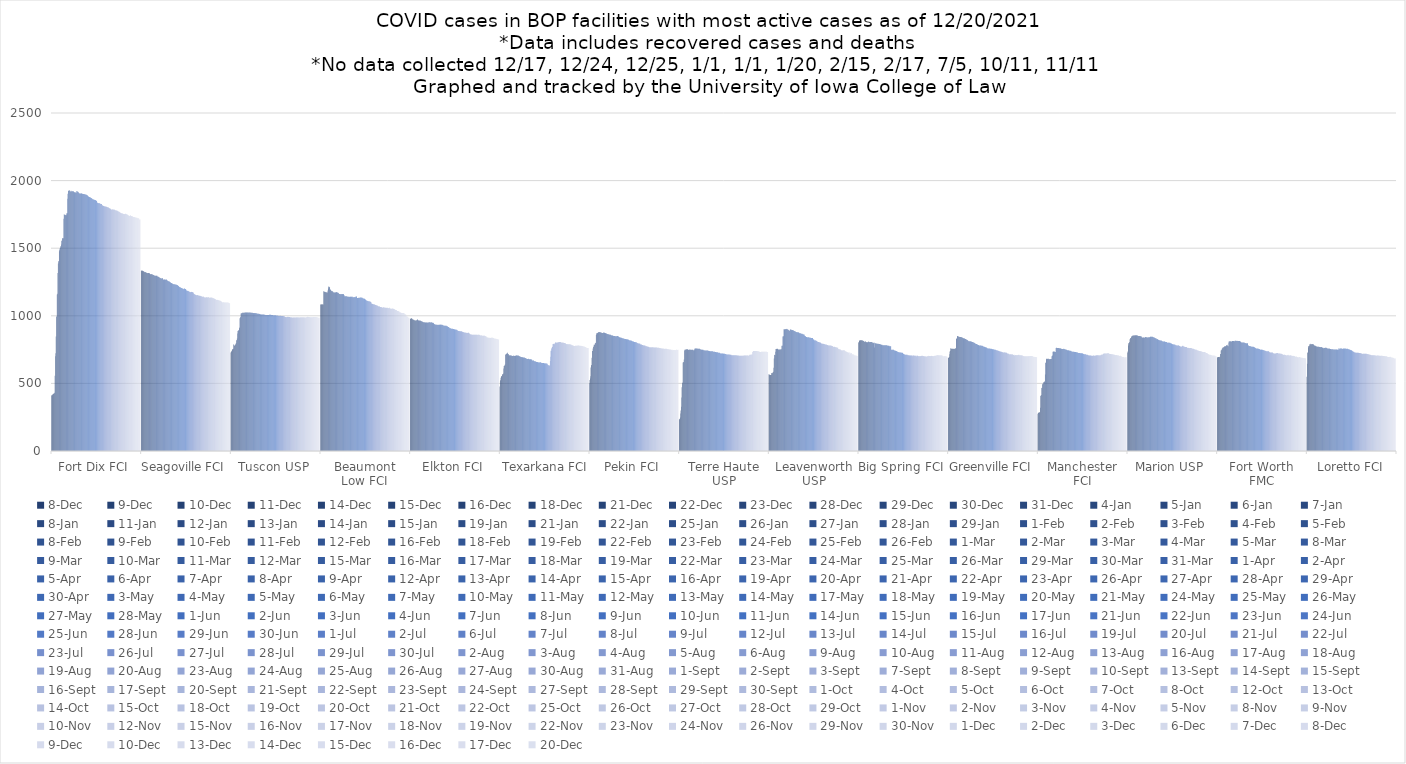
| Category | 8-Dec | 9-Dec | 10-Dec | 11-Dec | 14-Dec | 15-Dec | 16-Dec | 18-Dec | 21-Dec | 22-Dec | 23-Dec | 28-Dec | 29-Dec | 30-Dec | 31-Dec | 4-Jan | 5-Jan | 6-Jan | 7-Jan | 8-Jan | 11-Jan | 12-Jan | 13-Jan | 14-Jan | 15-Jan | 19-Jan | 21-Jan | 22-Jan | 25-Jan | 26-Jan | 27-Jan | 28-Jan | 29-Jan | 1-Feb | 2-Feb | 3-Feb | 4-Feb | 5-Feb | 8-Feb | 9-Feb | 10-Feb | 11-Feb | 12-Feb | 16-Feb | 18-Feb | 19-Feb | 22-Feb | 23-Feb | 24-Feb | 25-Feb | 26-Feb | 1-Mar | 2-Mar | 3-Mar | 4-Mar | 5-Mar | 8-Mar | 9-Mar | 10-Mar | 11-Mar | 12-Mar | 15-Mar | 16-Mar | 17-Mar | 18-Mar | 19-Mar | 22-Mar | 23-Mar | 24-Mar | 25-Mar | 26-Mar | 29-Mar | 30-Mar | 31-Mar | 1-Apr | 2-Apr | 5-Apr | 6-Apr | 7-Apr | 8-Apr | 9-Apr | 12-Apr | 13-Apr | 14-Apr | 15-Apr | 16-Apr | 19-Apr | 20-Apr | 21-Apr | 22-Apr | 23-Apr | 26-Apr | 27-Apr | 28-Apr | 29-Apr | 30-Apr | 3-May | 4-May | 5-May | 6-May | 7-May | 10-May | 11-May | 12-May | 13-May | 14-May | 17-May | 18-May | 19-May | 20-May | 21-May | 24-May | 25-May | 26-May | 27-May | 28-May | 1-Jun | 2-Jun | 3-Jun | 4-Jun | 7-Jun | 8-Jun | 9-Jun | 10-Jun | 11-Jun | 14-Jun | 15-Jun | 16-Jun | 17-Jun | 21-Jun | 22-Jun | 23-Jun | 24-Jun | 25-Jun | 28-Jun | 29-Jun | 30-Jun | 1-Jul | 2-Jul | 6-Jul | 7-Jul | 8-Jul | 9-Jul | 12-Jul | 13-Jul | 14-Jul | 15-Jul | 16-Jul | 19-Jul | 20-Jul | 21-Jul | 22-Jul | 23-Jul | 26-Jul | 27-Jul | 28-Jul | 29-Jul | 30-Jul | 2-Aug | 3-Aug | 4-Aug | 5-Aug | 6-Aug | 9-Aug | 10-Aug | 11-Aug | 12-Aug | 13-Aug | 16-Aug | 17-Aug | 18-Aug | 19-Aug | 20-Aug | 23-Aug | 24-Aug | 25-Aug | 26-Aug | 27-Aug | 30-Aug | 31-Aug | 1-Sep | 2-Sep | 3-Sep | 7-Sep | 8-Sep | 9-Sep | 10-Sep | 13-Sep | 14-Sep | 15-Sep | 16-Sep | 17-Sep | 20-Sep | 21-Sep | 22-Sep | 23-Sep | 24-Sep | 27-Sep | 28-Sep | 29-Sep | 30-Sep | 1-Oct | 4-Oct | 5-Oct | 6-Oct | 7-Oct | 8-Oct | 12-Oct | 13-Oct | 14-Oct | 15-Oct | 18-Oct | 19-Oct | 20-Oct | 21-Oct | 22-Oct | 25-Oct | 26-Oct | 27-Oct | 28-Oct | 29-Oct | 1-Nov | 2-Nov | 3-Nov | 4-Nov | 5-Nov | 8-Nov | 9-Nov | 10-Nov | 12-Nov | 15-Nov | 16-Nov | 17-Nov | 18-Nov | 19-Nov | 22-Nov | 23-Nov | 24-Nov | 26-Nov | 29-Nov | 30-Nov | 1-Dec | 2-Dec | 3-Dec | 6-Dec | 7-Dec | 13-Dec | 17-Dec | 20-Dec |
|---|---|---|---|---|---|---|---|---|---|---|---|---|---|---|---|---|---|---|---|---|---|---|---|---|---|---|---|---|---|---|---|---|---|---|---|---|---|---|---|---|---|---|---|---|---|---|---|---|---|---|---|---|---|---|---|---|---|---|---|---|---|---|---|---|---|---|---|---|---|---|---|---|---|---|---|---|---|---|---|---|---|---|---|---|---|---|---|---|---|---|---|---|---|---|---|---|---|---|---|---|---|---|---|---|---|---|---|---|---|---|---|---|---|---|---|---|---|---|---|---|---|---|---|---|---|---|---|---|---|---|---|---|---|---|---|---|---|---|---|---|---|---|---|---|---|---|---|---|---|---|---|---|---|---|---|---|---|---|---|---|---|---|---|---|---|---|---|---|---|---|---|---|---|---|---|---|---|---|---|---|---|---|---|---|---|---|---|---|---|---|---|---|---|---|---|---|---|---|---|---|---|---|---|---|---|---|---|---|---|---|---|---|---|---|---|---|---|---|---|---|---|---|---|---|---|---|---|---|---|---|---|---|---|---|---|---|---|---|---|---|---|---|---|---|---|---|---|---|---|
| Fort Dix FCI | 1723 | 1722 | 1722 | 415 | 1721 | 1717 | 1711 | 424 | 427 | 430 | 556 | 700 | 723 | 847 | 991 | 997 | 1158 | 1163 | 1316 | 1387 | 1401 | 1406 | 1478 | 1487 | 1497 | 1502 | 1515 | 1512 | 1527 | 1556 | 1556 | 1574 | 1573 | 1573 | 1574 | 1718 | 1751 | 1748 | 1748 | 1747 | 1746 | 1743 | 1743 | 1751 | 1760 | 1758 | 1865 | 1902 | 1925 | 1923 | 1927 | 1927 | 1928 | 1926 | 1921 | 1918 | 1924 | 1925 | 1920 | 1915 | 1923 | 1923 | 1922 | 1922 | 1917 | 1913 | 1913 | 1913 | 1913 | 1913 | 1909 | 1910 | 1923 | 1921 | 1921 | 1918 | 1917 | 1915 | 1910 | 1906 | 1906 | 1904 | 1904 | 1904 | 1904 | 1907 | 1905 | 1905 | 1903 | 1903 | 1901 | 1901 | 1900 | 1900 | 1900 | 1899 | 1897 | 1898 | 1897 | 1897 | 1895 | 1893 | 1892 | 1890 | 1890 | 1884 | 1883 | 1881 | 1878 | 1878 | 1876 | 1876 | 1875 | 1872 | 1871 | 1870 | 1869 | 1863 | 1862 | 1862 | 1860 | 1860 | 1859 | 1859 | 1857 | 1857 | 1855 | 1854 | 1853 | 1850 | 1850 | 1838 | 1837 | 1834 | 1834 | 1833 | 1833 | 1833 | 1833 | 1833 | 1827 | 1826 | 1827 | 1827 | 1826 | 1819 | 1816 | 1814 | 1814 | 1812 | 1812 | 1811 | 1810 | 1809 | 1809 | 1808 | 1807 | 1807 | 1807 | 1805 | 1803 | 1803 | 1802 | 1801 | 1800 | 1796 | 1795 | 1795 | 1794 | 1792 | 1789 | 1786 | 1786 | 1785 | 1788 | 1786 | 1786 | 1785 | 1786 | 1786 | 1784 | 1784 | 1782 | 1780 | 1779 | 1779 | 1779 | 1779 | 1778 | 1775 | 1773 | 1772 | 1772 | 1772 | 1769 | 1767 | 1764 | 1762 | 1762 | 1761 | 1759 | 1758 | 1757 | 1757 | 1756 | 1754 | 1753 | 1753 | 1753 | 1752 | 1753 | 1753 | 1755 | 1754 | 1753 | 1751 | 1750 | 1750 | 1747 | 1745 | 1741 | 1741 | 1741 | 1739 | 1738 | 1738 | 1743 | 1743 | 1738 | 1737 | 1738 | 1739 | 1734 | 1732 | 1731 | 1731 | 1731 | 1731 | 1729 | 1728 | 1728 | 1725 | 1725 | 1725 | 1725 | 1725 | 1721 | 1711 | 1713 |
| Seagoville FCI | 1098 | 1098 | 1098 | 1334 | 1096 | 1096 | 1094 | 1329 | 1327 | 1326 | 1322 | 1324 | 1324 | 1322 | 1321 | 1320 | 1317 | 1316 | 1315 | 1316 | 1316 | 1317 | 1316 | 1315 | 1313 | 1314 | 1308 | 1307 | 1309 | 1309 | 1308 | 1308 | 1306 | 1305 | 1303 | 1302 | 1301 | 1300 | 1298 | 1297 | 1297 | 1296 | 1297 | 1296 | 1297 | 1297 | 1297 | 1290 | 1289 | 1288 | 1288 | 1287 | 1285 | 1282 | 1281 | 1279 | 1277 | 1277 | 1275 | 1276 | 1278 | 1278 | 1278 | 1269 | 1268 | 1267 | 1268 | 1268 | 1268 | 1267 | 1267 | 1268 | 1268 | 1268 | 1264 | 1262 | 1259 | 1258 | 1258 | 1254 | 1254 | 1252 | 1253 | 1249 | 1248 | 1244 | 1243 | 1242 | 1241 | 1238 | 1238 | 1236 | 1235 | 1234 | 1234 | 1234 | 1233 | 1232 | 1232 | 1232 | 1230 | 1230 | 1229 | 1227 | 1227 | 1224 | 1223 | 1221 | 1218 | 1215 | 1213 | 1211 | 1211 | 1210 | 1208 | 1206 | 1206 | 1204 | 1201 | 1201 | 1201 | 1199 | 1197 | 1199 | 1203 | 1202 | 1198 | 1199 | 1196 | 1192 | 1187 | 1186 | 1185 | 1184 | 1185 | 1184 | 1182 | 1180 | 1178 | 1177 | 1175 | 1175 | 1176 | 1177 | 1176 | 1176 | 1176 | 1175 | 1175 | 1174 | 1166 | 1165 | 1162 | 1159 | 1158 | 1156 | 1155 | 1153 | 1152 | 1152 | 1153 | 1153 | 1152 | 1150 | 1151 | 1150 | 1149 | 1149 | 1149 | 1149 | 1147 | 1144 | 1144 | 1145 | 1142 | 1141 | 1141 | 1141 | 1142 | 1140 | 1138 | 1136 | 1137 | 1136 | 1136 | 1136 | 1137 | 1138 | 1137 | 1137 | 1135 | 1136 | 1138 | 1137 | 1137 | 1134 | 1133 | 1133 | 1134 | 1136 | 1136 | 1135 | 1134 | 1134 | 1134 | 1130 | 1130 | 1129 | 1129 | 1126 | 1126 | 1126 | 1124 | 1122 | 1121 | 1119 | 1117 | 1117 | 1118 | 1116 | 1116 | 1115 | 1115 | 1115 | 1113 | 1112 | 1111 | 1111 | 1110 | 1106 | 1105 | 1104 | 1101 | 1099 | 1100 | 1100 | 1100 | 1100 | 1098 | 1098 | 1098 | 1099 | 1098 | 1098 | 1099 | 1098 | 1097 | 1093 | 1092 |
| Tuscon USP | 990 | 989 | 989 | 741 | 986 | 986 | 985 | 756 | 787 | 787 | 779 | 779 | 784 | 787 | 789 | 798 | 819 | 819 | 833 | 869 | 887 | 889 | 891 | 895 | 908 | 913 | 981 | 990 | 990 | 1017 | 1019 | 1018 | 1019 | 1023 | 1023 | 1023 | 1022 | 1022 | 1022 | 1023 | 1024 | 1024 | 1024 | 1025 | 1025 | 1025 | 1025 | 1025 | 1025 | 1025 | 1024 | 1024 | 1023 | 1024 | 1024 | 1024 | 1024 | 1023 | 1023 | 1022 | 1023 | 1022 | 1022 | 1020 | 1021 | 1020 | 1019 | 1019 | 1020 | 1020 | 1020 | 1019 | 1019 | 1019 | 1018 | 1016 | 1016 | 1017 | 1016 | 1016 | 1016 | 1015 | 1014 | 1013 | 1011 | 1011 | 1009 | 1010 | 1010 | 1010 | 1010 | 1009 | 1009 | 1009 | 1009 | 1009 | 1007 | 1007 | 1007 | 1005 | 1005 | 1005 | 1006 | 1006 | 1006 | 1006 | 1006 | 1006 | 1006 | 1006 | 1007 | 1007 | 1007 | 1007 | 1007 | 1007 | 1006 | 1006 | 1006 | 1006 | 1005 | 1004 | 1004 | 1003 | 1004 | 1004 | 1003 | 1003 | 1004 | 1004 | 1003 | 1003 | 1001 | 1001 | 1002 | 1002 | 1000 | 999 | 999 | 999 | 1000 | 1000 | 1000 | 999 | 999 | 999 | 999 | 998 | 998 | 998 | 998 | 996 | 996 | 996 | 994 | 992 | 992 | 992 | 989 | 991 | 990 | 992 | 992 | 993 | 993 | 991 | 991 | 992 | 991 | 991 | 990 | 989 | 988 | 988 | 989 | 987 | 986 | 987 | 987 | 988 | 988 | 987 | 987 | 987 | 987 | 987 | 987 | 988 | 988 | 989 | 989 | 988 | 988 | 988 | 988 | 989 | 987 | 987 | 987 | 988 | 989 | 990 | 989 | 988 | 989 | 989 | 988 | 988 | 989 | 989 | 989 | 988 | 988 | 988 | 988 | 988 | 990 | 990 | 991 | 991 | 993 | 993 | 992 | 992 | 992 | 992 | 990 | 989 | 990 | 989 | 990 | 990 | 990 | 989 | 989 | 991 | 992 | 992 | 991 | 991 | 991 | 992 | 991 | 991 | 991 | 991 | 987 | 985 | 985 |
| Beaumont Low FCI | 998 | 995 | 994 | 1084 | 991 | 988 | 988 | 1081 | 1083 | 1184 | 1178 | 1178 | 1178 | 1178 | 1176 | 1175 | 1174 | 1175 | 1173 | 1173 | 1172 | 1187 | 1201 | 1215 | 1217 | 1214 | 1211 | 1211 | 1194 | 1194 | 1190 | 1186 | 1183 | 1182 | 1182 | 1182 | 1177 | 1174 | 1173 | 1173 | 1173 | 1173 | 1173 | 1172 | 1174 | 1174 | 1176 | 1175 | 1174 | 1173 | 1169 | 1170 | 1168 | 1163 | 1162 | 1162 | 1162 | 1161 | 1160 | 1157 | 1161 | 1161 | 1161 | 1162 | 1160 | 1160 | 1160 | 1161 | 1153 | 1145 | 1144 | 1142 | 1146 | 1145 | 1145 | 1144 | 1143 | 1142 | 1141 | 1141 | 1140 | 1140 | 1140 | 1141 | 1139 | 1140 | 1140 | 1141 | 1140 | 1140 | 1141 | 1140 | 1140 | 1136 | 1136 | 1139 | 1139 | 1139 | 1137 | 1135 | 1140 | 1140 | 1143 | 1142 | 1142 | 1132 | 1132 | 1132 | 1132 | 1133 | 1133 | 1133 | 1133 | 1133 | 1135 | 1136 | 1136 | 1136 | 1134 | 1133 | 1133 | 1130 | 1129 | 1127 | 1128 | 1128 | 1127 | 1125 | 1123 | 1120 | 1117 | 1115 | 1114 | 1112 | 1112 | 1110 | 1110 | 1108 | 1108 | 1107 | 1107 | 1105 | 1104 | 1104 | 1103 | 1100 | 1091 | 1090 | 1090 | 1087 | 1087 | 1086 | 1086 | 1085 | 1084 | 1083 | 1083 | 1079 | 1079 | 1079 | 1078 | 1077 | 1077 | 1076 | 1073 | 1070 | 1070 | 1069 | 1069 | 1069 | 1068 | 1066 | 1065 | 1065 | 1065 | 1065 | 1060 | 1059 | 1062 | 1062 | 1063 | 1064 | 1062 | 1062 | 1060 | 1060 | 1059 | 1059 | 1057 | 1059 | 1059 | 1059 | 1059 | 1057 | 1057 | 1056 | 1056 | 1059 | 1059 | 1054 | 1054 | 1053 | 1053 | 1053 | 1053 | 1053 | 1054 | 1054 | 1054 | 1051 | 1051 | 1050 | 1049 | 1046 | 1045 | 1042 | 1043 | 1042 | 1042 | 1037 | 1036 | 1035 | 1035 | 1035 | 1031 | 1032 | 1030 | 1025 | 1025 | 1025 | 1024 | 1023 | 1021 | 1021 | 1020 | 1020 | 1020 | 1020 | 1020 | 1019 | 1016 | 1017 | 1009 | 1010 | 1011 | 1008 | 994 | 985 | 985 |
| Elkton FCI | 830 | 829 | 829 | 980 | 828 | 825 | 825 | 975 | 973 | 971 | 970 | 970 | 969 | 966 | 966 | 966 | 966 | 966 | 966 | 969 | 971 | 973 | 973 | 967 | 965 | 966 | 964 | 965 | 965 | 965 | 963 | 961 | 959 | 959 | 959 | 957 | 955 | 955 | 953 | 953 | 953 | 952 | 951 | 951 | 951 | 951 | 951 | 951 | 951 | 950 | 948 | 950 | 951 | 951 | 953 | 953 | 953 | 953 | 951 | 951 | 952 | 952 | 950 | 948 | 948 | 948 | 948 | 947 | 943 | 939 | 938 | 937 | 936 | 934 | 936 | 934 | 933 | 933 | 932 | 933 | 933 | 932 | 934 | 934 | 934 | 934 | 934 | 935 | 934 | 933 | 933 | 933 | 933 | 932 | 930 | 929 | 928 | 928 | 927 | 926 | 927 | 927 | 926 | 926 | 926 | 923 | 922 | 921 | 920 | 918 | 918 | 918 | 913 | 910 | 907 | 907 | 907 | 906 | 905 | 905 | 904 | 904 | 904 | 903 | 903 | 903 | 901 | 900 | 898 | 898 | 898 | 896 | 896 | 896 | 896 | 894 | 892 | 889 | 887 | 887 | 887 | 887 | 886 | 886 | 886 | 886 | 885 | 885 | 884 | 883 | 881 | 880 | 880 | 879 | 879 | 877 | 877 | 875 | 876 | 875 | 875 | 874 | 873 | 873 | 873 | 874 | 874 | 874 | 874 | 872 | 867 | 865 | 863 | 863 | 861 | 861 | 861 | 860 | 860 | 859 | 859 | 860 | 860 | 860 | 860 | 860 | 860 | 860 | 860 | 859 | 859 | 859 | 858 | 860 | 860 | 860 | 860 | 860 | 860 | 858 | 857 | 855 | 855 | 856 | 855 | 855 | 853 | 853 | 853 | 853 | 853 | 852 | 854 | 853 | 850 | 850 | 848 | 848 | 846 | 841 | 841 | 840 | 840 | 838 | 838 | 837 | 837 | 837 | 836 | 836 | 836 | 838 | 838 | 838 | 837 | 837 | 838 | 838 | 836 | 836 | 834 | 832 | 830 | 831 | 831 | 831 | 829 | 824 | 825 |
| Texarkana FCI | 767 | 764 | 764 | 541 | 762 | 762 | 761 | 566 | 567 | 567 | 574 | 610 | 629 | 630 | 633 | 639 | 711 | 713 | 717 | 720 | 721 | 722 | 723 | 728 | 718 | 717 | 708 | 707 | 709 | 708 | 708 | 706 | 706 | 705 | 707 | 705 | 703 | 703 | 703 | 707 | 705 | 702 | 703 | 704 | 704 | 704 | 704 | 707 | 708 | 707 | 706 | 705 | 708 | 707 | 704 | 702 | 701 | 701 | 701 | 697 | 696 | 694 | 695 | 695 | 694 | 693 | 693 | 691 | 691 | 691 | 691 | 691 | 688 | 687 | 688 | 685 | 684 | 682 | 681 | 681 | 681 | 682 | 682 | 680 | 678 | 679 | 678 | 678 | 678 | 678 | 677 | 677 | 676 | 670 | 670 | 670 | 670 | 671 | 666 | 664 | 663 | 663 | 663 | 661 | 661 | 658 | 658 | 658 | 658 | 657 | 657 | 655 | 655 | 654 | 655 | 656 | 656 | 656 | 653 | 652 | 651 | 651 | 650 | 650 | 650 | 650 | 650 | 649 | 649 | 648 | 649 | 648 | 648 | 647 | 647 | 647 | 646 | 639 | 636 | 635 | 634 | 633 | 633 | 633 | 665 | 698 | 742 | 742 | 756 | 763 | 771 | 770 | 792 | 792 | 794 | 790 | 790 | 794 | 798 | 804 | 803 | 800 | 802 | 801 | 803 | 803 | 803 | 803 | 805 | 807 | 807 | 806 | 807 | 807 | 807 | 805 | 802 | 801 | 802 | 802 | 801 | 800 | 800 | 800 | 798 | 799 | 799 | 798 | 796 | 794 | 791 | 790 | 791 | 791 | 790 | 790 | 790 | 790 | 790 | 790 | 789 | 789 | 788 | 787 | 786 | 785 | 783 | 783 | 783 | 781 | 780 | 779 | 776 | 776 | 777 | 777 | 778 | 778 | 778 | 778 | 778 | 778 | 779 | 780 | 780 | 780 | 780 | 779 | 779 | 778 | 778 | 778 | 777 | 778 | 777 | 776 | 776 | 776 | 773 | 773 | 773 | 774 | 772 | 771 | 770 | 769 | 763 | 761 | 762 |
| Pekin FCI | 747 | 746 | 748 | 552 | 748 | 748 | 747 | 690 | 739 | 739 | 758 | 771 | 771 | 786 | 786 | 785 | 796 | 800 | 798 | 858 | 868 | 873 | 871 | 872 | 874 | 876 | 879 | 880 | 881 | 879 | 880 | 877 | 878 | 879 | 875 | 874 | 873 | 873 | 873 | 872 | 876 | 876 | 876 | 874 | 873 | 872 | 871 | 871 | 870 | 870 | 867 | 865 | 865 | 864 | 864 | 863 | 861 | 862 | 860 | 859 | 859 | 859 | 857 | 856 | 855 | 855 | 855 | 855 | 852 | 850 | 850 | 851 | 851 | 850 | 849 | 849 | 849 | 849 | 849 | 850 | 850 | 850 | 850 | 846 | 843 | 841 | 841 | 841 | 841 | 838 | 838 | 837 | 838 | 835 | 834 | 834 | 834 | 834 | 831 | 831 | 831 | 829 | 829 | 829 | 829 | 826 | 826 | 826 | 826 | 824 | 824 | 824 | 823 | 821 | 818 | 819 | 819 | 818 | 818 | 817 | 815 | 815 | 813 | 812 | 810 | 810 | 809 | 808 | 807 | 806 | 806 | 806 | 805 | 805 | 804 | 803 | 801 | 798 | 797 | 797 | 796 | 796 | 796 | 795 | 793 | 793 | 788 | 788 | 788 | 787 | 786 | 784 | 784 | 784 | 783 | 781 | 780 | 780 | 780 | 780 | 779 | 774 | 775 | 775 | 775 | 774 | 772 | 771 | 771 | 771 | 770 | 768 | 768 | 768 | 768 | 766 | 767 | 767 | 766 | 767 | 767 | 767 | 766 | 767 | 765 | 765 | 765 | 765 | 766 | 766 | 766 | 766 | 765 | 766 | 764 | 764 | 764 | 764 | 764 | 763 | 761 | 761 | 760 | 761 | 760 | 759 | 760 | 759 | 759 | 757 | 758 | 758 | 758 | 755 | 755 | 756 | 757 | 756 | 756 | 755 | 756 | 756 | 755 | 754 | 753 | 752 | 752 | 752 | 751 | 751 | 751 | 752 | 750 | 747 | 747 | 749 | 749 | 749 | 746 | 746 | 747 | 747 | 747 | 747 | 747 | 747 | 748 | 747 | 748 |
| Terre Haute USP | 734 | 734 | 735 | 247 | 735 | 735 | 733 | 396 | 472 | 501 | 507 | 655 | 656 | 658 | 676 | 742 | 748 | 748 | 747 | 752 | 753 | 753 | 751 | 752 | 752 | 750 | 747 | 749 | 749 | 749 | 750 | 749 | 749 | 750 | 747 | 748 | 748 | 748 | 748 | 748 | 748 | 744 | 745 | 746 | 752 | 758 | 758 | 758 | 758 | 759 | 758 | 758 | 758 | 757 | 757 | 757 | 757 | 757 | 757 | 756 | 755 | 751 | 751 | 750 | 749 | 749 | 748 | 748 | 748 | 748 | 746 | 746 | 746 | 744 | 744 | 744 | 744 | 744 | 744 | 744 | 744 | 743 | 743 | 742 | 741 | 740 | 740 | 739 | 738 | 738 | 738 | 738 | 738 | 737 | 737 | 737 | 737 | 736 | 735 | 735 | 735 | 735 | 734 | 733 | 733 | 732 | 731 | 731 | 730 | 731 | 730 | 729 | 727 | 727 | 726 | 726 | 726 | 724 | 722 | 722 | 722 | 722 | 722 | 722 | 722 | 722 | 722 | 720 | 720 | 720 | 720 | 719 | 717 | 717 | 717 | 715 | 714 | 714 | 713 | 713 | 713 | 713 | 713 | 713 | 713 | 711 | 712 | 711 | 711 | 711 | 709 | 709 | 709 | 709 | 709 | 709 | 709 | 709 | 709 | 709 | 708 | 708 | 708 | 708 | 708 | 707 | 707 | 707 | 707 | 707 | 706 | 705 | 705 | 704 | 704 | 704 | 704 | 704 | 704 | 704 | 705 | 705 | 705 | 705 | 705 | 706 | 706 | 706 | 706 | 706 | 706 | 706 | 706 | 706 | 706 | 707 | 708 | 705 | 705 | 704 | 709 | 709 | 711 | 711 | 711 | 711 | 711 | 713 | 713 | 713 | 732 | 735 | 739 | 739 | 739 | 740 | 739 | 740 | 740 | 740 | 739 | 739 | 739 | 738 | 738 | 739 | 739 | 737 | 735 | 735 | 734 | 734 | 733 | 733 | 733 | 734 | 735 | 735 | 734 | 734 | 734 | 735 | 735 | 735 | 735 | 735 | 734 | 733 | 733 |
| Leavenworth USP | 707 | 707 | 706 | 564 | 704 | 705 | 704 | 564 | 576 | 577 | 575 | 577 | 584 | 586 | 615 | 685 | 712 | 710 | 709 | 735 | 754 | 754 | 755 | 756 | 756 | 756 | 755 | 751 | 750 | 750 | 751 | 748 | 752 | 751 | 750 | 752 | 752 | 778 | 777 | 781 | 847 | 850 | 846 | 900 | 899 | 901 | 901 | 901 | 900 | 902 | 903 | 901 | 905 | 901 | 900 | 897 | 897 | 895 | 890 | 889 | 891 | 898 | 898 | 898 | 896 | 896 | 894 | 895 | 895 | 893 | 894 | 891 | 890 | 888 | 887 | 884 | 885 | 882 | 880 | 880 | 879 | 879 | 879 | 879 | 876 | 878 | 877 | 873 | 874 | 870 | 872 | 870 | 869 | 869 | 866 | 868 | 868 | 864 | 865 | 862 | 862 | 862 | 859 | 851 | 851 | 849 | 847 | 844 | 844 | 843 | 842 | 842 | 839 | 841 | 841 | 841 | 840 | 838 | 837 | 837 | 838 | 835 | 835 | 835 | 835 | 835 | 835 | 827 | 826 | 822 | 822 | 820 | 816 | 819 | 818 | 818 | 816 | 814 | 814 | 809 | 807 | 806 | 807 | 807 | 806 | 805 | 801 | 802 | 801 | 801 | 796 | 796 | 796 | 795 | 792 | 793 | 793 | 792 | 792 | 791 | 790 | 788 | 787 | 788 | 788 | 785 | 786 | 782 | 784 | 784 | 782 | 781 | 781 | 781 | 780 | 781 | 781 | 781 | 778 | 778 | 778 | 776 | 775 | 776 | 772 | 770 | 771 | 771 | 771 | 769 | 769 | 767 | 768 | 767 | 766 | 765 | 763 | 764 | 764 | 753 | 754 | 754 | 753 | 750 | 752 | 748 | 748 | 746 | 746 | 744 | 744 | 743 | 746 | 746 | 746 | 745 | 745 | 744 | 741 | 738 | 737 | 736 | 735 | 735 | 732 | 730 | 730 | 727 | 729 | 729 | 729 | 712 | 728 | 726 | 718 | 724 | 724 | 724 | 716 | 715 | 715 | 714 | 714 | 713 | 712 | 709 | 706 | 702 | 703 |
| Big Spring FCI | 701 | 702 | 702 | 815 | 700 | 702 | 698 | 819 | 819 | 820 | 820 | 818 | 818 | 818 | 814 | 814 | 811 | 808 | 807 | 810 | 810 | 809 | 807 | 805 | 804 | 804 | 804 | 805 | 807 | 809 | 809 | 807 | 804 | 807 | 806 | 806 | 807 | 807 | 807 | 804 | 803 | 800 | 800 | 797 | 801 | 765 | 801 | 800 | 798 | 795 | 795 | 795 | 795 | 794 | 793 | 793 | 793 | 793 | 792 | 792 | 791 | 791 | 790 | 789 | 788 | 786 | 786 | 785 | 785 | 783 | 783 | 783 | 783 | 783 | 782 | 783 | 783 | 782 | 782 | 782 | 782 | 782 | 781 | 780 | 779 | 779 | 778 | 778 | 778 | 775 | 775 | 774 | 774 | 774 | 749 | 749 | 749 | 749 | 749 | 749 | 749 | 748 | 746 | 743 | 743 | 742 | 741 | 741 | 739 | 737 | 739 | 738 | 733 | 732 | 732 | 730 | 730 | 730 | 729 | 729 | 729 | 728 | 728 | 727 | 727 | 727 | 727 | 725 | 719 | 719 | 717 | 716 | 714 | 714 | 712 | 712 | 712 | 711 | 711 | 711 | 711 | 709 | 709 | 709 | 709 | 708 | 707 | 707 | 707 | 707 | 707 | 706 | 706 | 706 | 706 | 700 | 707 | 707 | 707 | 707 | 704 | 704 | 704 | 705 | 705 | 698 | 704 | 704 | 704 | 704 | 704 | 702 | 701 | 701 | 701 | 702 | 701 | 701 | 703 | 703 | 703 | 704 | 704 | 704 | 703 | 703 | 702 | 701 | 701 | 700 | 699 | 700 | 699 | 699 | 698 | 699 | 699 | 700 | 700 | 702 | 704 | 701 | 703 | 703 | 703 | 701 | 702 | 702 | 702 | 704 | 703 | 703 | 702 | 701 | 701 | 702 | 702 | 702 | 704 | 705 | 705 | 705 | 704 | 707 | 708 | 709 | 709 | 710 | 710 | 709 | 707 | 708 | 708 | 707 | 707 | 708 | 708 | 708 | 707 | 707 | 705 | 705 | 701 | 700 | 701 | 701 | 701 | 698 | 698 |
| Greenville FCI | 696 | 696 | 697 | 695 | 696 | 696 | 696 | 760 | 759 | 758 | 756 | 754 | 756 | 756 | 756 | 755 | 757 | 757 | 756 | 755 | 756 | 759 | 761 | 828 | 829 | 836 | 850 | 850 | 849 | 848 | 846 | 844 | 844 | 845 | 844 | 844 | 844 | 843 | 841 | 841 | 841 | 838 | 836 | 836 | 834 | 833 | 833 | 832 | 833 | 829 | 829 | 829 | 825 | 822 | 822 | 821 | 820 | 818 | 814 | 812 | 812 | 812 | 811 | 811 | 811 | 810 | 810 | 809 | 807 | 807 | 807 | 806 | 805 | 803 | 801 | 800 | 798 | 797 | 794 | 794 | 792 | 791 | 791 | 788 | 787 | 785 | 784 | 784 | 783 | 781 | 781 | 781 | 780 | 780 | 780 | 779 | 778 | 778 | 778 | 776 | 775 | 773 | 772 | 771 | 771 | 770 | 769 | 768 | 765 | 765 | 765 | 763 | 761 | 759 | 759 | 759 | 759 | 759 | 759 | 759 | 756 | 756 | 757 | 756 | 756 | 755 | 754 | 753 | 752 | 753 | 753 | 751 | 750 | 749 | 749 | 748 | 748 | 747 | 745 | 745 | 744 | 743 | 744 | 743 | 739 | 739 | 737 | 737 | 737 | 736 | 736 | 734 | 734 | 734 | 733 | 732 | 731 | 728 | 728 | 729 | 729 | 729 | 730 | 729 | 729 | 726 | 727 | 727 | 727 | 723 | 721 | 719 | 719 | 719 | 719 | 715 | 714 | 715 | 715 | 715 | 714 | 714 | 716 | 715 | 714 | 714 | 712 | 710 | 710 | 711 | 707 | 707 | 709 | 710 | 710 | 710 | 709 | 709 | 709 | 710 | 710 | 710 | 711 | 711 | 709 | 708 | 708 | 708 | 708 | 708 | 708 | 707 | 706 | 706 | 705 | 703 | 703 | 701 | 701 | 701 | 701 | 700 | 700 | 700 | 700 | 700 | 700 | 701 | 701 | 701 | 701 | 702 | 701 | 702 | 702 | 702 | 703 | 703 | 702 | 702 | 702 | 702 | 700 | 698 | 699 | 696 | 696 | 694 | 695 |
| Manchester FCI | 695 | 694 | 692 | 283 | 694 | 693 | 693 | 320 | 406 | 410 | 414 | 466 | 467 | 492 | 498 | 498 | 502 | 510 | 511 | 513 | 516 | 566 | 651 | 655 | 679 | 682 | 682 | 682 | 681 | 682 | 684 | 681 | 679 | 681 | 679 | 679 | 681 | 680 | 680 | 680 | 701 | 704 | 706 | 735 | 734 | 736 | 736 | 736 | 735 | 734 | 733 | 733 | 762 | 763 | 763 | 761 | 761 | 762 | 761 | 761 | 762 | 760 | 759 | 761 | 760 | 759 | 758 | 757 | 756 | 755 | 755 | 754 | 754 | 755 | 756 | 756 | 754 | 752 | 752 | 750 | 750 | 749 | 749 | 748 | 746 | 746 | 746 | 746 | 745 | 744 | 743 | 741 | 741 | 741 | 740 | 741 | 738 | 736 | 736 | 734 | 734 | 734 | 734 | 734 | 734 | 733 | 733 | 733 | 733 | 732 | 731 | 730 | 730 | 730 | 727 | 726 | 725 | 725 | 725 | 725 | 724 | 724 | 723 | 723 | 723 | 723 | 723 | 723 | 721 | 721 | 720 | 718 | 718 | 716 | 716 | 716 | 715 | 715 | 713 | 712 | 711 | 710 | 711 | 711 | 710 | 707 | 706 | 706 | 706 | 706 | 706 | 706 | 707 | 705 | 705 | 705 | 704 | 703 | 704 | 706 | 707 | 705 | 705 | 705 | 705 | 706 | 707 | 707 | 708 | 708 | 708 | 708 | 709 | 707 | 708 | 708 | 708 | 707 | 707 | 709 | 709 | 712 | 712 | 712 | 712 | 712 | 715 | 717 | 720 | 721 | 721 | 721 | 721 | 721 | 721 | 721 | 722 | 722 | 722 | 723 | 723 | 723 | 723 | 723 | 721 | 717 | 718 | 718 | 718 | 717 | 716 | 716 | 717 | 716 | 715 | 714 | 714 | 713 | 712 | 711 | 711 | 710 | 710 | 709 | 710 | 710 | 709 | 708 | 708 | 707 | 707 | 706 | 706 | 702 | 702 | 704 | 704 | 704 | 700 | 700 | 699 | 698 | 696 | 696 | 696 | 695 | 692 | 693 | 694 |
| Marion USP | 706 | 705 | 706 | 795 | 704 | 704 | 700 | 827 | 833 | 835 | 836 | 847 | 845 | 850 | 851 | 854 | 855 | 854 | 854 | 854 | 854 | 856 | 856 | 855 | 857 | 858 | 855 | 855 | 855 | 855 | 853 | 850 | 850 | 850 | 850 | 851 | 851 | 848 | 848 | 848 | 846 | 841 | 840 | 839 | 838 | 839 | 839 | 839 | 836 | 838 | 843 | 843 | 843 | 842 | 841 | 841 | 841 | 840 | 839 | 840 | 841 | 841 | 840 | 841 | 843 | 845 | 845 | 845 | 845 | 845 | 845 | 845 | 845 | 844 | 843 | 840 | 840 | 840 | 837 | 835 | 834 | 834 | 834 | 830 | 827 | 828 | 827 | 827 | 823 | 822 | 821 | 820 | 820 | 820 | 818 | 818 | 818 | 818 | 815 | 813 | 812 | 810 | 810 | 810 | 810 | 809 | 809 | 809 | 808 | 807 | 806 | 806 | 806 | 806 | 801 | 801 | 801 | 800 | 802 | 801 | 800 | 800 | 800 | 798 | 796 | 796 | 796 | 794 | 792 | 790 | 790 | 789 | 788 | 788 | 787 | 787 | 786 | 785 | 783 | 782 | 782 | 781 | 781 | 780 | 781 | 781 | 782 | 781 | 779 | 777 | 776 | 775 | 771 | 773 | 773 | 769 | 775 | 776 | 778 | 778 | 775 | 773 | 771 | 771 | 772 | 770 | 770 | 770 | 770 | 770 | 767 | 763 | 763 | 762 | 763 | 761 | 761 | 761 | 760 | 761 | 761 | 761 | 761 | 761 | 759 | 758 | 756 | 756 | 756 | 756 | 754 | 752 | 752 | 752 | 750 | 749 | 748 | 748 | 748 | 745 | 745 | 744 | 743 | 742 | 741 | 740 | 740 | 739 | 739 | 738 | 737 | 736 | 737 | 735 | 734 | 732 | 733 | 733 | 732 | 731 | 732 | 732 | 732 | 730 | 724 | 724 | 724 | 724 | 724 | 720 | 719 | 718 | 715 | 713 | 711 | 711 | 711 | 711 | 710 | 710 | 710 | 708 | 706 | 706 | 706 | 706 | 705 | 700 | 700 |
| Fort Worth FMC | 688 | 687 | 687 | 695 | 687 | 686 | 686 | 698 | 695 | 717 | 717 | 743 | 746 | 749 | 756 | 760 | 765 | 762 | 767 | 769 | 769 | 775 | 775 | 773 | 774 | 777 | 781 | 782 | 782 | 785 | 780 | 777 | 775 | 802 | 811 | 811 | 810 | 810 | 811 | 811 | 810 | 810 | 810 | 814 | 814 | 814 | 813 | 814 | 813 | 811 | 812 | 816 | 816 | 816 | 816 | 816 | 814 | 814 | 815 | 814 | 814 | 814 | 814 | 814 | 813 | 813 | 810 | 810 | 808 | 805 | 803 | 802 | 803 | 802 | 802 | 803 | 803 | 802 | 800 | 800 | 798 | 798 | 797 | 796 | 797 | 797 | 798 | 799 | 792 | 784 | 778 | 776 | 776 | 776 | 775 | 775 | 775 | 775 | 772 | 772 | 772 | 772 | 772 | 771 | 771 | 769 | 768 | 768 | 765 | 764 | 762 | 760 | 759 | 758 | 757 | 758 | 758 | 757 | 756 | 756 | 755 | 754 | 753 | 751 | 749 | 749 | 748 | 749 | 750 | 749 | 748 | 747 | 747 | 746 | 745 | 744 | 743 | 742 | 741 | 740 | 739 | 738 | 738 | 738 | 738 | 738 | 737 | 737 | 737 | 734 | 732 | 729 | 729 | 728 | 729 | 728 | 729 | 729 | 728 | 728 | 725 | 723 | 722 | 720 | 721 | 721 | 721 | 721 | 721 | 722 | 725 | 725 | 724 | 724 | 724 | 722 | 721 | 722 | 722 | 721 | 721 | 719 | 719 | 719 | 719 | 717 | 716 | 715 | 714 | 712 | 710 | 711 | 711 | 711 | 711 | 710 | 710 | 709 | 709 | 705 | 710 | 707 | 710 | 711 | 709 | 706 | 707 | 707 | 707 | 706 | 708 | 708 | 707 | 704 | 704 | 703 | 704 | 703 | 704 | 703 | 703 | 703 | 701 | 699 | 698 | 698 | 698 | 699 | 697 | 695 | 694 | 693 | 693 | 693 | 691 | 695 | 695 | 695 | 691 | 691 | 690 | 689 | 689 | 689 | 689 | 688 | 688 | 686 | 684 |
| Loretto FCI | 690 | 690 | 688 | 730 | 684 | 684 | 684 | 777 | 787 | 790 | 788 | 793 | 791 | 790 | 790 | 791 | 792 | 790 | 789 | 788 | 788 | 782 | 781 | 779 | 778 | 778 | 774 | 773 | 773 | 774 | 772 | 772 | 772 | 772 | 771 | 771 | 770 | 770 | 770 | 770 | 767 | 770 | 770 | 768 | 765 | 764 | 764 | 763 | 758 | 762 | 762 | 761 | 764 | 764 | 764 | 764 | 763 | 762 | 760 | 758 | 759 | 758 | 758 | 757 | 757 | 758 | 757 | 755 | 754 | 754 | 753 | 753 | 752 | 752 | 752 | 753 | 751 | 750 | 750 | 750 | 750 | 751 | 751 | 751 | 751 | 750 | 750 | 751 | 749 | 748 | 747 | 758 | 758 | 753 | 759 | 759 | 759 | 759 | 759 | 758 | 758 | 757 | 757 | 754 | 754 | 758 | 760 | 758 | 758 | 757 | 757 | 758 | 758 | 755 | 756 | 756 | 756 | 756 | 754 | 753 | 753 | 752 | 751 | 749 | 748 | 747 | 746 | 746 | 745 | 743 | 741 | 738 | 737 | 734 | 734 | 734 | 731 | 729 | 728 | 728 | 726 | 727 | 726 | 726 | 726 | 726 | 726 | 726 | 726 | 725 | 724 | 725 | 725 | 724 | 723 | 723 | 721 | 722 | 720 | 720 | 717 | 719 | 719 | 719 | 719 | 719 | 719 | 720 | 720 | 720 | 719 | 719 | 717 | 717 | 717 | 716 | 716 | 715 | 714 | 713 | 712 | 712 | 711 | 710 | 710 | 709 | 709 | 709 | 709 | 709 | 709 | 709 | 709 | 708 | 708 | 707 | 707 | 707 | 707 | 704 | 705 | 707 | 707 | 707 | 706 | 706 | 705 | 705 | 705 | 704 | 704 | 704 | 703 | 704 | 704 | 704 | 704 | 703 | 703 | 703 | 703 | 703 | 703 | 701 | 701 | 701 | 700 | 700 | 700 | 699 | 698 | 697 | 696 | 696 | 695 | 695 | 696 | 696 | 697 | 697 | 695 | 693 | 692 | 692 | 692 | 690 | 688 | 684 | 684 |